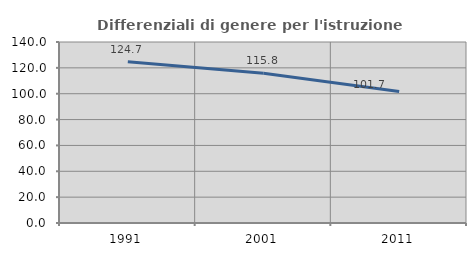
| Category | Differenziali di genere per l'istruzione superiore |
|---|---|
| 1991.0 | 124.669 |
| 2001.0 | 115.757 |
| 2011.0 | 101.747 |